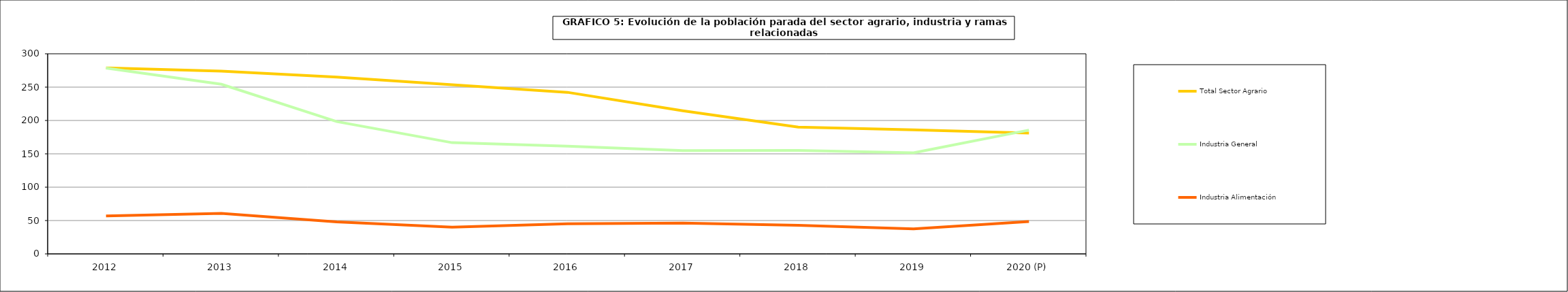
| Category | Total Sector Agrario | Industria General | Industria Alimentación |
|---|---|---|---|
| 2012 | 278.9 | 278.675 | 56.8 |
| 2013 | 273.925 | 254.3 | 60.8 |
| 2014 | 265.1 | 198.3 | 47.85 |
| 2015 | 253.575 | 166.725 | 40.1 |
| 2016 | 242.2 | 161.6 | 45.23 |
| 2017 | 214.5 | 154.8 | 46.3 |
| 2018 | 190.1 | 154.975 | 42.9 |
| 2019 | 186.075 | 151.6 | 37.575 |
| 2020 (P) | 181.2 | 185.6 | 48.4 |